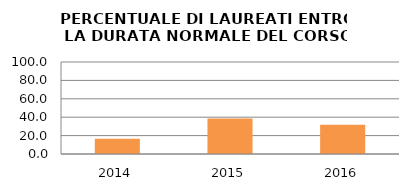
| Category | 2014 2015 2016 |
|---|---|
| 2014.0 | 16.667 |
| 2015.0 | 38.462 |
| 2016.0 | 31.707 |